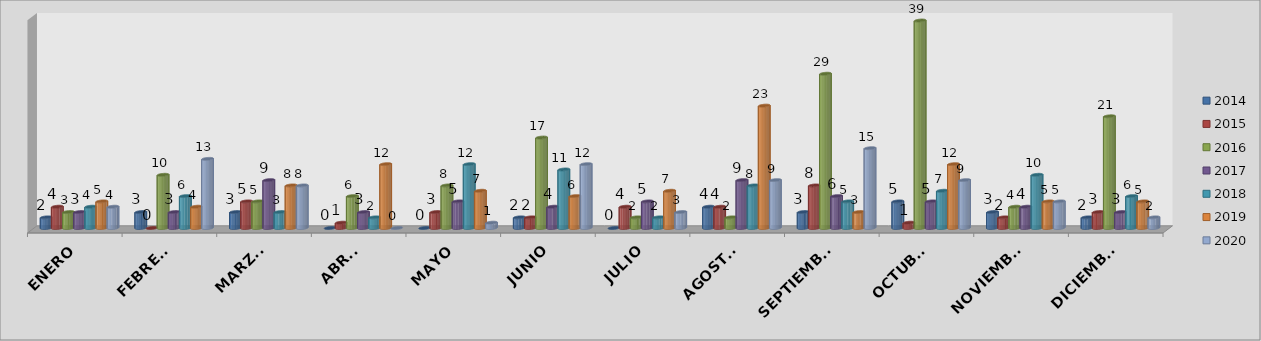
| Category | 2014 | 2015 | 2016 | 2017 | 2018 | 2019 | 2020 |
|---|---|---|---|---|---|---|---|
| ENERO | 2 | 4 | 3 | 3 | 4 | 5 | 4 |
| FEBRERO | 3 | 0 | 10 | 3 | 6 | 4 | 13 |
| MARZO  | 3 | 5 | 5 | 9 | 3 | 8 | 8 |
| ABRIL | 0 | 1 | 6 | 3 | 2 | 12 | 0 |
| MAYO | 0 | 3 | 8 | 5 | 12 | 7 | 1 |
| JUNIO | 2 | 2 | 17 | 4 | 11 | 6 | 12 |
| JULIO | 0 | 4 | 2 | 5 | 2 | 7 | 3 |
| AGOSTO | 4 | 4 | 2 | 9 | 8 | 23 | 9 |
| SEPTIEMBRE | 3 | 8 | 29 | 6 | 5 | 3 | 15 |
| OCTUBRE | 5 | 1 | 39 | 5 | 7 | 12 | 9 |
| NOVIEMBRE | 3 | 2 | 4 | 4 | 10 | 5 | 5 |
| DICIEMBRE | 2 | 3 | 21 | 3 | 6 | 5 | 2 |